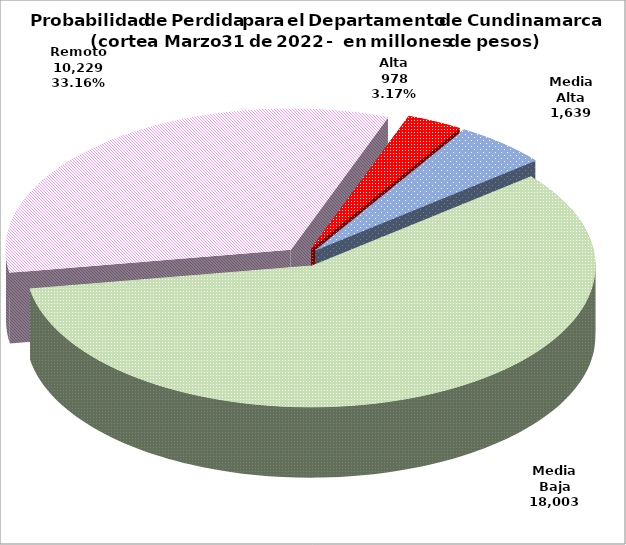
| Category | Series 0 |
|---|---|
| Alta | 978.44 |
| Media Alta | 1638.556 |
| Media Baja | 18003.369 |
| Remoto | 10229.468 |